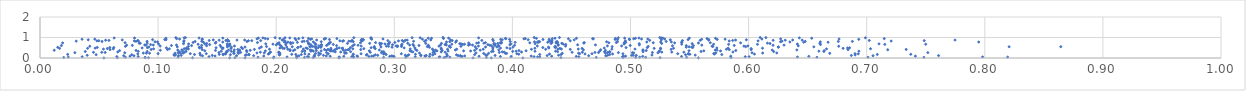
| Category | Series 0 |
|---|---|
| 0.0540942870294151 | 0.001 |
| 0.40886845140047423 | 0.002 |
| 0.1605944647929466 | 0.003 |
| 0.38212092751394233 | 0.004 |
| 0.17359225121704114 | 0.005 |
| 0.36664608597317083 | 0.006 |
| 0.2530607779439691 | 0.007 |
| 0.5574864697422024 | 0.008 |
| 0.19767930518774945 | 0.009 |
| 0.12914190328536845 | 0.01 |
| 0.21730001199507987 | 0.011 |
| 0.5250402116378716 | 0.012 |
| 0.1650703270302094 | 0.013 |
| 0.09189524203989019 | 0.014 |
| 0.0654822651212057 | 0.015 |
| 0.4410805469836039 | 0.016 |
| 0.2312880378395482 | 0.017 |
| 0.5851247602364527 | 0.018 |
| 0.3421270204857324 | 0.019 |
| 0.25361050785670314 | 0.02 |
| 0.08887857148563327 | 0.021 |
| 0.3779611297054507 | 0.022 |
| 0.08920475595001065 | 0.023 |
| 0.4939042026503495 | 0.024 |
| 0.02008181661649 | 0.025 |
| 0.22395417443664833 | 0.026 |
| 0.47101833892064715 | 0.027 |
| 0.5043907270085362 | 0.028 |
| 0.547491142459574 | 0.029 |
| 0.2909771930811075 | 0.03 |
| 0.5128005379081321 | 0.031 |
| 0.7484350532678364 | 0.032 |
| 0.7011566071755353 | 0.033 |
| 0.6578455257614994 | 0.034 |
| 0.18460859287842069 | 0.035 |
| 0.07231866723735159 | 0.036 |
| 0.3096719428447966 | 0.037 |
| 0.507729946858212 | 0.038 |
| 0.3470531104410354 | 0.039 |
| 0.11689867432728751 | 0.04 |
| 0.2655995269276128 | 0.041 |
| 0.8193065682897964 | 0.042 |
| 0.023964042940966213 | 0.043 |
| 0.3379505452487537 | 0.044 |
| 0.4231939673578655 | 0.045 |
| 0.6413527285026096 | 0.046 |
| 0.22742562661017296 | 0.047 |
| 0.19803603254586633 | 0.048 |
| 0.3437736157103456 | 0.049 |
| 0.25328843667959167 | 0.05 |
| 0.20917724028094642 | 0.051 |
| 0.4213415709865078 | 0.052 |
| 0.7981105590118986 | 0.053 |
| 0.3386209023380533 | 0.054 |
| 0.2648912761154766 | 0.055 |
| 0.2322503983667471 | 0.056 |
| 0.3177491732644566 | 0.057 |
| 0.035733152202977236 | 0.058 |
| 0.49316645395700054 | 0.059 |
| 0.45626676977327707 | 0.06 |
| 0.5971969994706883 | 0.061 |
| 0.6004181860574483 | 0.062 |
| 0.22637582527557998 | 0.063 |
| 0.4183170477930892 | 0.064 |
| 0.26396329955847175 | 0.065 |
| 0.14309676002361538 | 0.066 |
| 0.06507368304191607 | 0.067 |
| 0.08314040277092849 | 0.068 |
| 0.2688775349442457 | 0.069 |
| 0.27849688852758814 | 0.07 |
| 0.3898476854431908 | 0.071 |
| 0.2997503807077265 | 0.072 |
| 0.39890029771960633 | 0.073 |
| 0.3573883510753435 | 0.074 |
| 0.5432145146174978 | 0.075 |
| 0.32983311651535874 | 0.076 |
| 0.4541092993550597 | 0.077 |
| 0.29611718115813135 | 0.078 |
| 0.6509764839331083 | 0.079 |
| 0.5102724916522082 | 0.08 |
| 0.2173409404219233 | 0.081 |
| 0.2572679904536139 | 0.082 |
| 0.37176997831798664 | 0.083 |
| 0.24573496480594192 | 0.084 |
| 0.35631488373603615 | 0.085 |
| 0.4332539385633518 | 0.086 |
| 0.49403351065409606 | 0.087 |
| 0.5848278376568531 | 0.088 |
| 0.0761747058794855 | 0.089 |
| 0.28084867536992075 | 0.09 |
| 0.49582039555459 | 0.091 |
| 0.29874626535260984 | 0.092 |
| 0.7412471932651071 | 0.093 |
| 0.18943493957622348 | 0.094 |
| 0.32612964688812385 | 0.095 |
| 0.4159212426057187 | 0.096 |
| 0.14825971350633516 | 0.097 |
| 0.2324247613193433 | 0.098 |
| 0.3259893901908171 | 0.099 |
| 0.2823653100632614 | 0.1 |
| 0.29763498223741525 | 0.101 |
| 0.35963369776370757 | 0.102 |
| 0.24244541639007544 | 0.103 |
| 0.26841482833657127 | 0.104 |
| 0.21914258846291068 | 0.105 |
| 0.13757344363900226 | 0.106 |
| 0.4790826314151425 | 0.107 |
| 0.3449067171550285 | 0.108 |
| 0.07955137637918919 | 0.109 |
| 0.07083085094575547 | 0.11 |
| 0.4645850100749691 | 0.111 |
| 0.705353606960645 | 0.112 |
| 0.3111357707312109 | 0.113 |
| 0.16643547362257383 | 0.114 |
| 0.18091801689070852 | 0.115 |
| 0.35400967228046987 | 0.116 |
| 0.42945208536038315 | 0.117 |
| 0.7608639006393343 | 0.118 |
| 0.3559219318768273 | 0.119 |
| 0.11736098230629721 | 0.12 |
| 0.32710402074586753 | 0.121 |
| 0.3223457903167962 | 0.122 |
| 0.6870177604268944 | 0.123 |
| 0.38537185579922995 | 0.124 |
| 0.2323168626901706 | 0.125 |
| 0.14589568501901973 | 0.126 |
| 0.11961608938223867 | 0.127 |
| 0.2400344147638066 | 0.128 |
| 0.5049110130467311 | 0.129 |
| 0.5023033860172906 | 0.13 |
| 0.501038315026717 | 0.131 |
| 0.28596063006258077 | 0.132 |
| 0.039963888898637 | 0.133 |
| 0.32266051390458317 | 0.134 |
| 0.4806823137101971 | 0.135 |
| 0.17390986889636195 | 0.136 |
| 0.4391259902641951 | 0.137 |
| 0.11420163852216891 | 0.138 |
| 0.30926786664989303 | 0.139 |
| 0.23598282767367706 | 0.14 |
| 0.5548261299145395 | 0.141 |
| 0.5181818852568074 | 0.142 |
| 0.2763613390325875 | 0.143 |
| 0.3785449588356943 | 0.144 |
| 0.13578030093078453 | 0.145 |
| 0.3325007690904972 | 0.146 |
| 0.20279313164571378 | 0.147 |
| 0.11343938013680843 | 0.148 |
| 0.6902454898137799 | 0.149 |
| 0.11365154500899688 | 0.15 |
| 0.3773131466529147 | 0.151 |
| 0.17487567274285842 | 0.152 |
| 0.28393603047639937 | 0.153 |
| 0.3122456963684995 | 0.154 |
| 0.3526181872591304 | 0.155 |
| 0.17695093188171318 | 0.156 |
| 0.11471873424003065 | 0.157 |
| 0.5466461994233052 | 0.158 |
| 0.07772541458302806 | 0.159 |
| 0.1611959757991306 | 0.16 |
| 0.26515745326929396 | 0.161 |
| 0.047533618402713085 | 0.162 |
| 0.1552289908118576 | 0.163 |
| 0.48231677903338277 | 0.164 |
| 0.368016860262089 | 0.165 |
| 0.22127087351960928 | 0.166 |
| 0.2930944628255412 | 0.167 |
| 0.5772953018690851 | 0.168 |
| 0.42315508627907017 | 0.169 |
| 0.4412424501140584 | 0.17 |
| 0.13082605366183198 | 0.171 |
| 0.2768376878935134 | 0.172 |
| 0.7089861447679616 | 0.173 |
| 0.20258487833539152 | 0.174 |
| 0.21656061708656493 | 0.175 |
| 0.023451869120320823 | 0.176 |
| 0.15178116373740425 | 0.177 |
| 0.17687049786818754 | 0.178 |
| 0.21313100037810362 | 0.179 |
| 0.31790758776422057 | 0.18 |
| 0.7373294700448437 | 0.181 |
| 0.5503156604558481 | 0.182 |
| 0.3445044492092467 | 0.183 |
| 0.22770259175871332 | 0.184 |
| 0.40541205084033327 | 0.185 |
| 0.26529815740249907 | 0.186 |
| 0.15487721519638642 | 0.187 |
| 0.3302532524021803 | 0.188 |
| 0.6049777680063444 | 0.189 |
| 0.19336729921385376 | 0.19 |
| 0.5710013788390521 | 0.191 |
| 0.2032156804885833 | 0.192 |
| 0.5489795501781892 | 0.193 |
| 0.43140523397758834 | 0.194 |
| 0.15714873149762187 | 0.195 |
| 0.2909306324755563 | 0.196 |
| 0.4614980117641653 | 0.197 |
| 0.48482737389508135 | 0.198 |
| 0.2243162818366965 | 0.199 |
| 0.3343664540107175 | 0.2 |
| 0.08280607164580422 | 0.201 |
| 0.23748272616994148 | 0.202 |
| 0.2441211428357002 | 0.203 |
| 0.6928926573190609 | 0.204 |
| 0.27186939813108346 | 0.205 |
| 0.3059689768086924 | 0.206 |
| 0.40379455862884284 | 0.207 |
| 0.49355168184428144 | 0.208 |
| 0.46737888410344863 | 0.209 |
| 0.5400122407285027 | 0.21 |
| 0.6901097768362299 | 0.211 |
| 0.14078995445771236 | 0.212 |
| 0.12728060718217538 | 0.213 |
| 0.10000780005184418 | 0.214 |
| 0.45695646794946787 | 0.215 |
| 0.19400415503359492 | 0.216 |
| 0.5490532341219237 | 0.217 |
| 0.570500360352658 | 0.218 |
| 0.29201050904153714 | 0.219 |
| 0.23325797609586696 | 0.22 |
| 0.15700111589302201 | 0.221 |
| 0.3756799958680206 | 0.222 |
| 0.1642711153723977 | 0.223 |
| 0.3950853089289945 | 0.224 |
| 0.1681254475970213 | 0.225 |
| 0.3941145219972646 | 0.226 |
| 0.6686922075296385 | 0.227 |
| 0.37984688624024743 | 0.228 |
| 0.44222728506399933 | 0.229 |
| 0.13539941825209256 | 0.23 |
| 0.25814795961481474 | 0.231 |
| 0.11892898251564987 | 0.232 |
| 0.4559955216201679 | 0.233 |
| 0.09276013187744336 | 0.234 |
| 0.09005819972424622 | 0.235 |
| 0.47882730919401517 | 0.236 |
| 0.11433933889334957 | 0.237 |
| 0.1640493985296122 | 0.238 |
| 0.3212948312615187 | 0.239 |
| 0.08748932248759722 | 0.24 |
| 0.25938590103613457 | 0.241 |
| 0.6118908458311865 | 0.242 |
| 0.20304444225919427 | 0.243 |
| 0.12119446699491898 | 0.244 |
| 0.6239064059380178 | 0.245 |
| 0.18367821405639517 | 0.246 |
| 0.12117037772929051 | 0.247 |
| 0.5027670712305818 | 0.248 |
| 0.5722467868348019 | 0.249 |
| 0.36919365749496824 | 0.25 |
| 0.23592377634031025 | 0.251 |
| 0.18992643609385385 | 0.252 |
| 0.6029214196379722 | 0.253 |
| 0.2892047334502309 | 0.254 |
| 0.07173650735138004 | 0.255 |
| 0.5232085675912235 | 0.256 |
| 0.11697003300449504 | 0.257 |
| 0.24271445363429722 | 0.258 |
| 0.029521177021993084 | 0.259 |
| 0.19452029613197208 | 0.26 |
| 0.501656063346728 | 0.261 |
| 0.751768867555628 | 0.262 |
| 0.47290531723321994 | 0.263 |
| 0.48975748097034744 | 0.264 |
| 0.2580703074361398 | 0.265 |
| 0.20210978386726353 | 0.266 |
| 0.15154968902529842 | 0.267 |
| 0.5185482540975138 | 0.268 |
| 0.4807009152818913 | 0.269 |
| 0.33281364875092334 | 0.27 |
| 0.05519362580155096 | 0.271 |
| 0.388910004254831 | 0.272 |
| 0.16985713681497827 | 0.273 |
| 0.4699096609074813 | 0.274 |
| 0.4823243359822518 | 0.275 |
| 0.05231007861053261 | 0.276 |
| 0.04530113488101106 | 0.277 |
| 0.2796367540435557 | 0.278 |
| 0.4505585044998486 | 0.279 |
| 0.34308810568803416 | 0.28 |
| 0.1676309221726512 | 0.281 |
| 0.45924435519361273 | 0.282 |
| 0.5451928556871176 | 0.283 |
| 0.1865769675855935 | 0.284 |
| 0.12233939612319045 | 0.285 |
| 0.15821470225530843 | 0.286 |
| 0.5265222926817369 | 0.287 |
| 0.19522119890387424 | 0.288 |
| 0.39302390178789615 | 0.289 |
| 0.5349579224689398 | 0.29 |
| 0.2022495934023847 | 0.291 |
| 0.4077279766282117 | 0.292 |
| 0.2546135153480853 | 0.293 |
| 0.5867465066239187 | 0.294 |
| 0.3396611606741351 | 0.295 |
| 0.06581626189654599 | 0.296 |
| 0.4820904595472323 | 0.297 |
| 0.3157160792848457 | 0.298 |
| 0.33397417831433984 | 0.299 |
| 0.4780047278409836 | 0.3 |
| 0.3914591863368915 | 0.301 |
| 0.25003242653650515 | 0.302 |
| 0.17514518798445888 | 0.303 |
| 0.48253478479450906 | 0.304 |
| 0.29104012529761814 | 0.305 |
| 0.5106693745816245 | 0.306 |
| 0.16418986810568803 | 0.307 |
| 0.2630215485893711 | 0.308 |
| 0.4382719282773093 | 0.309 |
| 0.2895742290435177 | 0.31 |
| 0.3823354609735572 | 0.311 |
| 0.11801617104597839 | 0.312 |
| 0.5243607669544426 | 0.313 |
| 0.6212439096838501 | 0.314 |
| 0.09073941231421756 | 0.315 |
| 0.6637348831060375 | 0.316 |
| 0.03836615339387972 | 0.317 |
| 0.5597329886902256 | 0.318 |
| 0.22192719341525968 | 0.319 |
| 0.1579502716721385 | 0.32 |
| 0.3143817724309923 | 0.321 |
| 0.22401867229602423 | 0.322 |
| 0.40026066449384057 | 0.323 |
| 0.12367507992144655 | 0.324 |
| 0.08318358163175532 | 0.325 |
| 0.16193994732823025 | 0.326 |
| 0.38370740159621686 | 0.327 |
| 0.41911729027765987 | 0.328 |
| 0.4031379408137107 | 0.329 |
| 0.15342184491439093 | 0.33 |
| 0.24817265464956528 | 0.331 |
| 0.6933856470380774 | 0.332 |
| 0.47388149370524935 | 0.333 |
| 0.4365950959711715 | 0.334 |
| 0.6595101689986487 | 0.335 |
| 0.2314575829296739 | 0.336 |
| 0.24628815101648593 | 0.337 |
| 0.34548048348298177 | 0.338 |
| 0.22418548183425058 | 0.339 |
| 0.22950625189339569 | 0.34 |
| 0.3646242304683327 | 0.341 |
| 0.22935293264825385 | 0.342 |
| 0.5762279639657201 | 0.343 |
| 0.5244778650859993 | 0.344 |
| 0.190860453921757 | 0.345 |
| 0.3361581727077735 | 0.346 |
| 0.23806057232527766 | 0.347 |
| 0.3586816306180687 | 0.348 |
| 0.5620930500184766 | 0.349 |
| 0.27882716412049713 | 0.35 |
| 0.12058573812933548 | 0.351 |
| 0.4115700681555875 | 0.352 |
| 0.3132596460880589 | 0.353 |
| 0.13953875711382568 | 0.354 |
| 0.5495679876042691 | 0.355 |
| 0.21168708333891284 | 0.356 |
| 0.23399826028899928 | 0.357 |
| 0.2144461218985908 | 0.358 |
| 0.6640150823037394 | 0.359 |
| 0.06737123968066205 | 0.36 |
| 0.4055796142128396 | 0.361 |
| 0.17488764742815988 | 0.362 |
| 0.513347818190408 | 0.363 |
| 0.5106381305972088 | 0.364 |
| 0.5891742687703194 | 0.365 |
| 0.3406093835635149 | 0.366 |
| 0.47886737058643425 | 0.367 |
| 0.31917014429268176 | 0.368 |
| 0.08131314113800847 | 0.369 |
| 0.14859908768558616 | 0.37 |
| 0.24239115556099733 | 0.371 |
| 0.1689252419307753 | 0.372 |
| 0.3679966556336267 | 0.373 |
| 0.24520989297377604 | 0.374 |
| 0.17802213458789062 | 0.375 |
| 0.23010286285420856 | 0.376 |
| 0.012054051091524465 | 0.377 |
| 0.10189255246785944 | 0.378 |
| 0.3331854315196452 | 0.379 |
| 0.25690291372720997 | 0.38 |
| 0.3727181893913415 | 0.381 |
| 0.1596231161373527 | 0.382 |
| 0.5733126447759941 | 0.383 |
| 0.25888369991968196 | 0.384 |
| 0.16896050976753285 | 0.385 |
| 0.3349973460664787 | 0.386 |
| 0.5717625068550424 | 0.387 |
| 0.6199996226808202 | 0.388 |
| 0.11659662866862508 | 0.389 |
| 0.2873416916621082 | 0.39 |
| 0.35169219717140376 | 0.391 |
| 0.2494671334667682 | 0.392 |
| 0.22882392817501596 | 0.393 |
| 0.6408876412663931 | 0.394 |
| 0.12009023711605038 | 0.395 |
| 0.3884590135256186 | 0.396 |
| 0.16450055614086212 | 0.397 |
| 0.4601061441600378 | 0.398 |
| 0.5105237672269737 | 0.399 |
| 0.4747862102342675 | 0.4 |
| 0.24650697807681965 | 0.401 |
| 0.7178007157594888 | 0.402 |
| 0.21579110866390006 | 0.403 |
| 0.2608207588715342 | 0.404 |
| 0.05931639725450111 | 0.405 |
| 0.6841731399280964 | 0.406 |
| 0.2116589247981574 | 0.407 |
| 0.6022011725251103 | 0.408 |
| 0.5836620229536453 | 0.409 |
| 0.1373202044537969 | 0.41 |
| 0.1079557276041565 | 0.411 |
| 0.2716081761296901 | 0.412 |
| 0.16748512025539175 | 0.413 |
| 0.31805030076486196 | 0.414 |
| 0.09412263582155012 | 0.415 |
| 0.24086571116030786 | 0.416 |
| 0.2615925339804903 | 0.417 |
| 0.1815384208791544 | 0.418 |
| 0.7334409940124001 | 0.419 |
| 0.243856963693029 | 0.42 |
| 0.44900967702858674 | 0.421 |
| 0.5344115503488059 | 0.422 |
| 0.41613599870146667 | 0.423 |
| 0.4281659546595892 | 0.424 |
| 0.345110016633588 | 0.425 |
| 0.5812239671355259 | 0.426 |
| 0.20979468434344428 | 0.427 |
| 0.19430813903478772 | 0.428 |
| 0.352911619994978 | 0.429 |
| 0.3752651385025304 | 0.43 |
| 0.43855531686928473 | 0.431 |
| 0.4842363826659063 | 0.432 |
| 0.05371224713646516 | 0.433 |
| 0.4557948018157857 | 0.434 |
| 0.33225354725119094 | 0.435 |
| 0.2229716969065666 | 0.436 |
| 0.5038054822914427 | 0.437 |
| 0.44148497588441604 | 0.438 |
| 0.3397127750934743 | 0.439 |
| 0.12567061098563348 | 0.44 |
| 0.38342709304278955 | 0.441 |
| 0.3135180701181023 | 0.442 |
| 0.12401926956083575 | 0.443 |
| 0.06205017251551814 | 0.444 |
| 0.26489334966718225 | 0.445 |
| 0.6659868586958057 | 0.446 |
| 0.09618187435817027 | 0.447 |
| 0.2512909064247024 | 0.448 |
| 0.1095263349558413 | 0.449 |
| 0.5255640655673814 | 0.45 |
| 0.15439632307642648 | 0.451 |
| 0.7032487727093113 | 0.452 |
| 0.12214822477980491 | 0.453 |
| 0.23378648082513198 | 0.454 |
| 0.28387094221410647 | 0.455 |
| 0.3695895044909242 | 0.456 |
| 0.2742194500105376 | 0.457 |
| 0.22643406499058683 | 0.458 |
| 0.6022079542437606 | 0.459 |
| 0.17156924240709936 | 0.46 |
| 0.05700984830482525 | 0.461 |
| 0.39799828616588795 | 0.462 |
| 0.2511903956960251 | 0.463 |
| 0.20674931355911585 | 0.464 |
| 0.1617411933558357 | 0.465 |
| 0.25588605006703846 | 0.466 |
| 0.4590271373520859 | 0.467 |
| 0.01657676193512303 | 0.468 |
| 0.5200474120847194 | 0.469 |
| 0.44023178517762673 | 0.47 |
| 0.6800229350120949 | 0.471 |
| 0.04033544117335597 | 0.472 |
| 0.24632511763343612 | 0.473 |
| 0.5253909777685899 | 0.474 |
| 0.5364605758163209 | 0.475 |
| 0.3397164185578896 | 0.476 |
| 0.4190521306279713 | 0.477 |
| 0.6117757524311124 | 0.478 |
| 0.5826912244834622 | 0.479 |
| 0.25619832456156943 | 0.48 |
| 0.18583291593050522 | 0.481 |
| 0.205445963647933 | 0.482 |
| 0.04671784000200374 | 0.483 |
| 0.38987559622634815 | 0.484 |
| 0.20313443214322258 | 0.485 |
| 0.4777646908273653 | 0.486 |
| 0.1550676809903052 | 0.487 |
| 0.43086219244130275 | 0.488 |
| 0.6838216412396104 | 0.489 |
| 0.5731304260556447 | 0.49 |
| 0.08648187094936921 | 0.491 |
| 0.3083140643041252 | 0.492 |
| 0.22524650655928025 | 0.493 |
| 0.3174180021486622 | 0.494 |
| 0.2532886667527644 | 0.495 |
| 0.13509285364642376 | 0.496 |
| 0.12422881509178674 | 0.497 |
| 0.10699937057693998 | 0.498 |
| 0.685504959564123 | 0.499 |
| 0.39533823259266343 | 0.5 |
| 0.14908678200780412 | 0.501 |
| 0.23555377954997625 | 0.502 |
| 0.2803746087249597 | 0.503 |
| 0.21813343500680238 | 0.504 |
| 0.2628701660859487 | 0.505 |
| 0.09099974402921396 | 0.506 |
| 0.5141748931908066 | 0.507 |
| 0.4962472544709532 | 0.508 |
| 0.4257585095507379 | 0.509 |
| 0.062450995364458306 | 0.51 |
| 0.05906076247130099 | 0.511 |
| 0.13673987828926149 | 0.512 |
| 0.2829270017636939 | 0.513 |
| 0.5527087440647269 | 0.514 |
| 0.0484965288588044 | 0.515 |
| 0.4366823516989853 | 0.516 |
| 0.383480215436354 | 0.517 |
| 0.1705043646012112 | 0.518 |
| 0.3297493243830667 | 0.519 |
| 0.23778141211331172 | 0.52 |
| 0.01500154246481089 | 0.521 |
| 0.3475603809570612 | 0.522 |
| 0.1349395956769961 | 0.523 |
| 0.21855462645302537 | 0.524 |
| 0.625259056152524 | 0.525 |
| 0.2981034296612841 | 0.526 |
| 0.43600807456380597 | 0.527 |
| 0.40043836841805125 | 0.528 |
| 0.5472031005321129 | 0.529 |
| 0.5517932124120958 | 0.53 |
| 0.43058608743073346 | 0.531 |
| 0.20897047426980309 | 0.532 |
| 0.16206599775363828 | 0.533 |
| 0.09215473606126601 | 0.534 |
| 0.17362784909044116 | 0.535 |
| 0.37727009017081437 | 0.536 |
| 0.2887047122317301 | 0.537 |
| 0.3868787103333716 | 0.538 |
| 0.18743276851921953 | 0.539 |
| 0.15330964950398662 | 0.54 |
| 0.6251777103484718 | 0.541 |
| 0.15864086864365778 | 0.542 |
| 0.11626697668230335 | 0.543 |
| 0.6552530285903205 | 0.544 |
| 0.23356561584570423 | 0.545 |
| 0.5496142167734286 | 0.546 |
| 0.23265644850876677 | 0.547 |
| 0.21360393927273058 | 0.548 |
| 0.8206011867308706 | 0.549 |
| 0.2284902598665619 | 0.55 |
| 0.864358627730994 | 0.551 |
| 0.3685126762343709 | 0.552 |
| 0.5975182397577139 | 0.553 |
| 0.48447943289999285 | 0.554 |
| 0.3026293833760476 | 0.555 |
| 0.3279504832844693 | 0.556 |
| 0.2830962891432022 | 0.557 |
| 0.1918216048102015 | 0.558 |
| 0.20449672558881282 | 0.559 |
| 0.3060441371341771 | 0.56 |
| 0.2207754151014275 | 0.561 |
| 0.5697109362043511 | 0.562 |
| 0.3466565172457563 | 0.563 |
| 0.436165805739694 | 0.564 |
| 0.23086349642061066 | 0.565 |
| 0.1256821332869268 | 0.566 |
| 0.5150099301080521 | 0.567 |
| 0.07232977881103764 | 0.568 |
| 0.2951177144496705 | 0.569 |
| 0.35638984144416097 | 0.57 |
| 0.2381945779596455 | 0.571 |
| 0.6763151876167465 | 0.572 |
| 0.042182937792348274 | 0.573 |
| 0.22954283855751478 | 0.574 |
| 0.5691153765419411 | 0.575 |
| 0.33785748342233257 | 0.576 |
| 0.2933250917249367 | 0.577 |
| 0.44499941520008823 | 0.578 |
| 0.2719808142950064 | 0.579 |
| 0.5960428494125608 | 0.58 |
| 0.38807774536775463 | 0.581 |
| 0.3466272133361954 | 0.582 |
| 0.3712226785081152 | 0.583 |
| 0.10175451085033305 | 0.584 |
| 0.16467375388049366 | 0.585 |
| 0.4924804970544383 | 0.586 |
| 0.2646375712626895 | 0.587 |
| 0.4210875377570722 | 0.588 |
| 0.3015696721298279 | 0.589 |
| 0.599384394433977 | 0.59 |
| 0.48045066700447725 | 0.591 |
| 0.30272631737043354 | 0.592 |
| 0.1602702311987093 | 0.593 |
| 0.6420540695803413 | 0.594 |
| 0.23616248479426782 | 0.595 |
| 0.3885615781319245 | 0.596 |
| 0.5355266493892819 | 0.597 |
| 0.1410547903160836 | 0.598 |
| 0.32880866159022437 | 0.599 |
| 0.15866723614675426 | 0.6 |
| 0.3821944622144512 | 0.601 |
| 0.31646070959975103 | 0.602 |
| 0.12837126116829423 | 0.603 |
| 0.5472581587414247 | 0.604 |
| 0.25114407147533324 | 0.605 |
| 0.5532723790018746 | 0.606 |
| 0.018095304358475617 | 0.607 |
| 0.11127280214576774 | 0.608 |
| 0.24267348012940093 | 0.609 |
| 0.3209020701913686 | 0.61 |
| 0.499785877946591 | 0.611 |
| 0.3852733324791233 | 0.612 |
| 0.5878544687060118 | 0.613 |
| 0.2036121490666526 | 0.614 |
| 0.07820221553041329 | 0.615 |
| 0.13686086391416696 | 0.616 |
| 0.15250357793819436 | 0.617 |
| 0.3289141725005398 | 0.618 |
| 0.40183452438069367 | 0.619 |
| 0.08980847353524246 | 0.62 |
| 0.6207199457334089 | 0.621 |
| 0.4386292016472054 | 0.622 |
| 0.26931206020007803 | 0.623 |
| 0.0733736137452009 | 0.624 |
| 0.3808360788184374 | 0.625 |
| 0.36278179432017743 | 0.626 |
| 0.30610518903183537 | 0.627 |
| 0.6299939991302634 | 0.628 |
| 0.5603593175960774 | 0.629 |
| 0.15968105602779326 | 0.63 |
| 0.3662631181888176 | 0.631 |
| 0.11556996930820174 | 0.632 |
| 0.3129870093164643 | 0.633 |
| 0.09597671262307872 | 0.634 |
| 0.3440109892385905 | 0.635 |
| 0.08868824885164428 | 0.636 |
| 0.23828831463933664 | 0.637 |
| 0.33918647348706865 | 0.638 |
| 0.4703275816351882 | 0.639 |
| 0.39785836818105014 | 0.64 |
| 0.5075162835240254 | 0.641 |
| 0.20809500206493192 | 0.642 |
| 0.20007481716550324 | 0.643 |
| 0.45524201334388337 | 0.644 |
| 0.2882050760045476 | 0.645 |
| 0.43890978179031903 | 0.646 |
| 0.29845026762070104 | 0.647 |
| 0.26608742228062265 | 0.648 |
| 0.37922697193211363 | 0.649 |
| 0.2383304422587551 | 0.65 |
| 0.16049340805900703 | 0.651 |
| 0.22927238775414727 | 0.652 |
| 0.09365680665522125 | 0.653 |
| 0.34299558720318346 | 0.654 |
| 0.14365618240638145 | 0.655 |
| 0.6608656757153266 | 0.656 |
| 0.4451841928084639 | 0.657 |
| 0.3639692708273762 | 0.658 |
| 0.315823324846469 | 0.659 |
| 0.3579721158723369 | 0.66 |
| 0.23357331790899327 | 0.661 |
| 0.2482939659316986 | 0.662 |
| 0.38451323277275884 | 0.663 |
| 0.7153283880385845 | 0.664 |
| 0.5830633471548177 | 0.665 |
| 0.60749987367949 | 0.666 |
| 0.2025933327854068 | 0.667 |
| 0.13386317584751273 | 0.668 |
| 0.5703691349059833 | 0.669 |
| 0.24385605426798307 | 0.67 |
| 0.34869224753825057 | 0.671 |
| 0.3594925367447439 | 0.672 |
| 0.749983177669072 | 0.673 |
| 0.3065653457477503 | 0.674 |
| 0.4431048615469786 | 0.675 |
| 0.5433224869048866 | 0.676 |
| 0.1972561117076087 | 0.677 |
| 0.3436952186895702 | 0.678 |
| 0.49459593606683905 | 0.679 |
| 0.3854617646723417 | 0.68 |
| 0.1608375873233423 | 0.681 |
| 0.6412976936443762 | 0.682 |
| 0.15853477339204358 | 0.683 |
| 0.22750424431335992 | 0.684 |
| 0.1003773585547858 | 0.685 |
| 0.12583962163058338 | 0.686 |
| 0.3986234824395486 | 0.687 |
| 0.2921031498081521 | 0.688 |
| 0.7104329689987282 | 0.689 |
| 0.2948535916731906 | 0.69 |
| 0.1911704043622705 | 0.691 |
| 0.13953673417745194 | 0.692 |
| 0.22759509006105327 | 0.693 |
| 0.21224467297303873 | 0.694 |
| 0.356459802170389 | 0.695 |
| 0.2954006974367148 | 0.696 |
| 0.3553900296604402 | 0.697 |
| 0.12153883922878528 | 0.698 |
| 0.5074239462953322 | 0.699 |
| 0.41928852249327153 | 0.7 |
| 0.5521830905241374 | 0.701 |
| 0.24490317015458785 | 0.702 |
| 0.20111003700539154 | 0.703 |
| 0.28919516367846354 | 0.704 |
| 0.6181630063012541 | 0.705 |
| 0.3843315861933234 | 0.706 |
| 0.3877397755992922 | 0.707 |
| 0.14116867170354486 | 0.708 |
| 0.43272335182570865 | 0.709 |
| 0.2603177520204597 | 0.71 |
| 0.5264071065146338 | 0.711 |
| 0.3266458304890397 | 0.712 |
| 0.27915051598713114 | 0.713 |
| 0.33993576276747317 | 0.714 |
| 0.2327943152807197 | 0.715 |
| 0.6602962974065198 | 0.716 |
| 0.08490176689593598 | 0.717 |
| 0.31140756694795535 | 0.718 |
| 0.39034913436055174 | 0.719 |
| 0.4418337706909915 | 0.72 |
| 0.28764552732687865 | 0.721 |
| 0.08394238882683713 | 0.722 |
| 0.09077091455190989 | 0.723 |
| 0.3758386017002281 | 0.724 |
| 0.6159571037006493 | 0.725 |
| 0.36978591460298726 | 0.726 |
| 0.14845405076628004 | 0.727 |
| 0.2085092687702117 | 0.728 |
| 0.49462452512023003 | 0.729 |
| 0.4604097302362641 | 0.73 |
| 0.5575168029956441 | 0.731 |
| 0.3629893437872507 | 0.732 |
| 0.43698400357533784 | 0.733 |
| 0.019168780836329558 | 0.734 |
| 0.5373827896103079 | 0.735 |
| 0.24495207986637357 | 0.736 |
| 0.43837951525775964 | 0.737 |
| 0.5932164289247975 | 0.738 |
| 0.21408421470767436 | 0.739 |
| 0.41472393904415583 | 0.74 |
| 0.22716764814586476 | 0.741 |
| 0.27134140446554633 | 0.742 |
| 0.5192727476032492 | 0.743 |
| 0.4816683720985635 | 0.744 |
| 0.5675740507863751 | 0.745 |
| 0.07206856144775398 | 0.746 |
| 0.20233948334086838 | 0.747 |
| 0.37134775820330357 | 0.748 |
| 0.3771889308138423 | 0.749 |
| 0.4609454421936813 | 0.75 |
| 0.2841344279376019 | 0.751 |
| 0.38979715818257865 | 0.752 |
| 0.1841302878170813 | 0.753 |
| 0.4879975486580753 | 0.754 |
| 0.21213031131636007 | 0.755 |
| 0.3907955984774666 | 0.756 |
| 0.12964139690853893 | 0.757 |
| 0.3004535461797174 | 0.758 |
| 0.43348516053461994 | 0.759 |
| 0.21794921501549014 | 0.76 |
| 0.4959637598177521 | 0.761 |
| 0.296040828747284 | 0.762 |
| 0.4023116881213925 | 0.763 |
| 0.42184889592120933 | 0.764 |
| 0.4950179044506362 | 0.765 |
| 0.2459167125512176 | 0.766 |
| 0.42990469714910884 | 0.767 |
| 0.13839194303641034 | 0.768 |
| 0.6672958860848293 | 0.769 |
| 0.1489737705733829 | 0.77 |
| 0.35193529385638844 | 0.771 |
| 0.6466511011670492 | 0.772 |
| 0.5434541258461308 | 0.773 |
| 0.5433837840666258 | 0.774 |
| 0.20993402648947002 | 0.775 |
| 0.20689507722578593 | 0.776 |
| 0.15474795687568488 | 0.777 |
| 0.5137907363369556 | 0.778 |
| 0.42129277230954687 | 0.779 |
| 0.7948708578819086 | 0.78 |
| 0.525538909438478 | 0.781 |
| 0.3442372856911874 | 0.782 |
| 0.6349791752603271 | 0.783 |
| 0.23145727553282835 | 0.784 |
| 0.5346157958964444 | 0.785 |
| 0.09951805913985667 | 0.786 |
| 0.4370503648846027 | 0.787 |
| 0.6607626748178965 | 0.788 |
| 0.4186684226270302 | 0.789 |
| 0.0974053096237627 | 0.79 |
| 0.48894669683411063 | 0.791 |
| 0.4797712127086189 | 0.792 |
| 0.12173138354573765 | 0.793 |
| 0.346992084837237 | 0.794 |
| 0.6270321341725855 | 0.795 |
| 0.2381217539929491 | 0.796 |
| 0.2652474669820848 | 0.797 |
| 0.42302548161022147 | 0.798 |
| 0.22198766093372924 | 0.799 |
| 0.43794781761444734 | 0.8 |
| 0.4222185638899598 | 0.801 |
| 0.30793079744768204 | 0.802 |
| 0.3982201074355729 | 0.803 |
| 0.17528226377234057 | 0.804 |
| 0.13135088269173634 | 0.805 |
| 0.6759594183590014 | 0.806 |
| 0.5302326070594162 | 0.807 |
| 0.05254149191617297 | 0.808 |
| 0.6878705687602767 | 0.809 |
| 0.6479558678956342 | 0.81 |
| 0.0906619562684915 | 0.811 |
| 0.08125749330350007 | 0.812 |
| 0.4309602513695566 | 0.813 |
| 0.31631993386187884 | 0.814 |
| 0.2633869493521154 | 0.815 |
| 0.13699741493979145 | 0.816 |
| 0.2236718517998808 | 0.817 |
| 0.628227175277352 | 0.818 |
| 0.3256049361688801 | 0.819 |
| 0.26152493866803805 | 0.82 |
| 0.25622033843210856 | 0.821 |
| 0.08335919041727069 | 0.822 |
| 0.030660336781176967 | 0.823 |
| 0.4322291622447606 | 0.824 |
| 0.2726060372963698 | 0.825 |
| 0.15873125349730843 | 0.826 |
| 0.7207277931813503 | 0.827 |
| 0.15994170761765603 | 0.828 |
| 0.20746803863147978 | 0.829 |
| 0.22637202758995278 | 0.83 |
| 0.07982800080419772 | 0.831 |
| 0.5835797612375642 | 0.832 |
| 0.4956729710753729 | 0.833 |
| 0.30356140753160066 | 0.834 |
| 0.35269616424764294 | 0.835 |
| 0.6080193064399616 | 0.836 |
| 0.048157070458571205 | 0.837 |
| 0.44896139996946827 | 0.838 |
| 0.43352565013674627 | 0.839 |
| 0.25387676498806133 | 0.84 |
| 0.25698570876589 | 0.841 |
| 0.12190642472932312 | 0.842 |
| 0.04977213665468905 | 0.843 |
| 0.17647674189880724 | 0.844 |
| 0.38380683027527807 | 0.845 |
| 0.1793327406406091 | 0.846 |
| 0.7487091986643094 | 0.847 |
| 0.34900987173625697 | 0.848 |
| 0.1868435625486332 | 0.849 |
| 0.29454049215960365 | 0.85 |
| 0.5440087859196585 | 0.851 |
| 0.3067555554050829 | 0.852 |
| 0.14326457156690964 | 0.853 |
| 0.5864997558988058 | 0.854 |
| 0.08271845041561421 | 0.855 |
| 0.7021957643632835 | 0.856 |
| 0.05835637374447433 | 0.857 |
| 0.15742932805016752 | 0.858 |
| 0.5162515186026329 | 0.859 |
| 0.37410799242984794 | 0.86 |
| 0.5589609284775267 | 0.861 |
| 0.2642843860616536 | 0.862 |
| 0.30928651304313104 | 0.863 |
| 0.2718104072439492 | 0.864 |
| 0.6207719538298546 | 0.865 |
| 0.32693906583834365 | 0.866 |
| 0.05556783243387364 | 0.867 |
| 0.15169133876007057 | 0.868 |
| 0.6309878109238307 | 0.869 |
| 0.5662602666435387 | 0.87 |
| 0.20512760619174952 | 0.871 |
| 0.31092640648165004 | 0.872 |
| 0.6453668286646532 | 0.873 |
| 0.16678623721336727 | 0.874 |
| 0.7747944317676503 | 0.875 |
| 0.5889634691424945 | 0.876 |
| 0.6373432321508701 | 0.877 |
| 0.23426607746316597 | 0.878 |
| 0.1732949301520289 | 0.879 |
| 0.21681687136069883 | 0.88 |
| 0.5260515258712141 | 0.881 |
| 0.06961806469154341 | 0.882 |
| 0.33088020514907424 | 0.883 |
| 0.14673362880716934 | 0.884 |
| 0.4523676687844763 | 0.885 |
| 0.3476219095835841 | 0.886 |
| 0.2737953511587664 | 0.887 |
| 0.5981224482498549 | 0.888 |
| 0.39140979296991185 | 0.889 |
| 0.04083965603655493 | 0.89 |
| 0.5336905187863492 | 0.891 |
| 0.4133496049788007 | 0.892 |
| 0.48900156773584225 | 0.893 |
| 0.15877577175646018 | 0.894 |
| 0.09533110696593272 | 0.895 |
| 0.10670143143711841 | 0.896 |
| 0.27373587839958125 | 0.897 |
| 0.548737179438445 | 0.898 |
| 0.10564570337272028 | 0.899 |
| 0.5662382663229266 | 0.9 |
| 0.20607803463943752 | 0.901 |
| 0.49916473342244505 | 0.902 |
| 0.2450851804859434 | 0.903 |
| 0.4259188736793491 | 0.904 |
| 0.5734215698261241 | 0.905 |
| 0.3833518149988113 | 0.906 |
| 0.3900744607536395 | 0.907 |
| 0.48700675130686943 | 0.908 |
| 0.3976001321606789 | 0.909 |
| 0.6932566098069308 | 0.91 |
| 0.5602429967788809 | 0.911 |
| 0.22884431762887425 | 0.912 |
| 0.4311150981086602 | 0.913 |
| 0.1373608907382987 | 0.914 |
| 0.03564521442577162 | 0.915 |
| 0.28081747512536215 | 0.916 |
| 0.3237962786653136 | 0.917 |
| 0.5801257334647504 | 0.918 |
| 0.27251510917119104 | 0.919 |
| 0.046367645966673754 | 0.92 |
| 0.24060357275641597 | 0.921 |
| 0.4989122126108477 | 0.922 |
| 0.13735673086993327 | 0.923 |
| 0.11817884340631524 | 0.924 |
| 0.6112689050966578 | 0.925 |
| 0.5093693593318297 | 0.926 |
| 0.6766112642205802 | 0.927 |
| 0.5290036007993035 | 0.928 |
| 0.5146503772012164 | 0.929 |
| 0.2904097353050603 | 0.93 |
| 0.19285840629844453 | 0.931 |
| 0.2300903330818853 | 0.932 |
| 0.6271441662183982 | 0.933 |
| 0.24101020075041635 | 0.934 |
| 0.4097328109391235 | 0.935 |
| 0.18373937379066663 | 0.936 |
| 0.5026777008291572 | 0.937 |
| 0.4685674374990231 | 0.938 |
| 0.4337828839149288 | 0.939 |
| 0.44743764548852993 | 0.94 |
| 0.394457444143519 | 0.941 |
| 0.4679373489770642 | 0.942 |
| 0.5262488431249588 | 0.943 |
| 0.11572374829491128 | 0.944 |
| 0.7148752909723307 | 0.945 |
| 0.2190664376240654 | 0.946 |
| 0.5647952994628556 | 0.947 |
| 0.25137727523817166 | 0.948 |
| 0.41089041062609755 | 0.949 |
| 0.215932056140974 | 0.95 |
| 0.19067669478224014 | 0.951 |
| 0.28026235978261715 | 0.952 |
| 0.3416762714109661 | 0.953 |
| 0.2418468635392519 | 0.954 |
| 0.39412037675278644 | 0.955 |
| 0.2273490414899888 | 0.956 |
| 0.4872536328834235 | 0.957 |
| 0.20308689773605781 | 0.958 |
| 0.4203182015281589 | 0.959 |
| 0.5720286418619918 | 0.96 |
| 0.5041976374244542 | 0.961 |
| 0.45424088521629125 | 0.962 |
| 0.3314827620635541 | 0.963 |
| 0.6534305931614429 | 0.964 |
| 0.4360812931948117 | 0.965 |
| 0.3287889425916005 | 0.966 |
| 0.1066817266561525 | 0.967 |
| 0.49505278584142165 | 0.968 |
| 0.5498211479553546 | 0.969 |
| 0.3459723955231564 | 0.97 |
| 0.5274720782853644 | 0.971 |
| 0.1548098681963368 | 0.972 |
| 0.18491857301860082 | 0.973 |
| 0.5071456685371724 | 0.974 |
| 0.0800547529844503 | 0.975 |
| 0.06279751640564046 | 0.976 |
| 0.1347250421406787 | 0.977 |
| 0.5260460289739303 | 0.978 |
| 0.21152010799383192 | 0.979 |
| 0.18878631487554098 | 0.98 |
| 0.6429723391512051 | 0.981 |
| 0.37137578593537546 | 0.982 |
| 0.22260529796208617 | 0.983 |
| 0.12207677796879579 | 0.984 |
| 0.48966243221725103 | 0.985 |
| 0.6989014816030742 | 0.986 |
| 0.32186363557032793 | 0.987 |
| 0.315088046079007 | 0.988 |
| 0.20744801827098647 | 0.989 |
| 0.26572307493207525 | 0.99 |
| 0.19908304335486027 | 0.991 |
| 0.28027099982020665 | 0.992 |
| 0.11502447911135749 | 0.993 |
| 0.12312335530281515 | 0.994 |
| 0.6146613173763347 | 0.995 |
| 0.5247874319447191 | 0.996 |
| 0.4398247831232196 | 0.997 |
| 0.4184270250923662 | 0.998 |
| 0.34126339186537935 | 0.999 |
| 0.6097643743711458 | 1 |